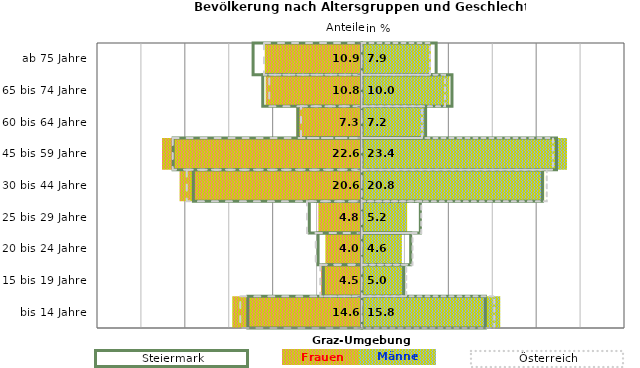
| Category | Frauen | Männer | Frauen Spalte2 | Männer Spalte2 | Frauen Spalte3 | Männer Spalte3 |
|---|---|---|---|---|---|---|
| bis 14 Jahre | -14.6 | 15.8 | 14.1 | -13 | -13.8 | 15.1 |
| 15 bis 19 Jahre | -4.5 | 5 | 4.8 | -4.4 | -4.7 | 5.1 |
| 20 bis 24 Jahre | -4 | 4.6 | 5.6 | -5 | -5.2 | 5.8 |
| 25 bis 29 Jahre | -4.8 | 5.2 | 6.7 | -6 | -6.2 | 6.8 |
| 30 bis 44 Jahre | -20.6 | 20.8 | 20.6 | -19.2 | -19.9 | 21.1 |
| 45 bis 59 Jahre | -22.6 | 23.4 | 22.2 | -21.5 | -21.5 | 21.8 |
| 60 bis 64 Jahre | -7.3 | 7.2 | 7.3 | -7.3 | -6.9 | 6.9 |
| 65 bis 74 Jahre | -10.8 | 10 | 10.3 | -11.3 | -10.5 | 9.5 |
| ab 75 Jahre | -10.9 | 7.9 | 8.5 | -12.4 | -11.1 | 7.8 |